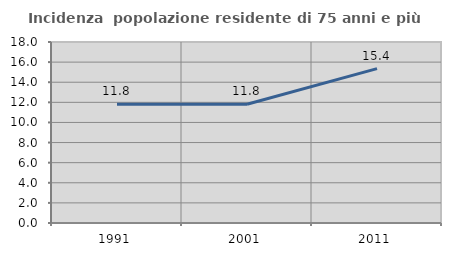
| Category | Incidenza  popolazione residente di 75 anni e più |
|---|---|
| 1991.0 | 11.821 |
| 2001.0 | 11.815 |
| 2011.0 | 15.355 |